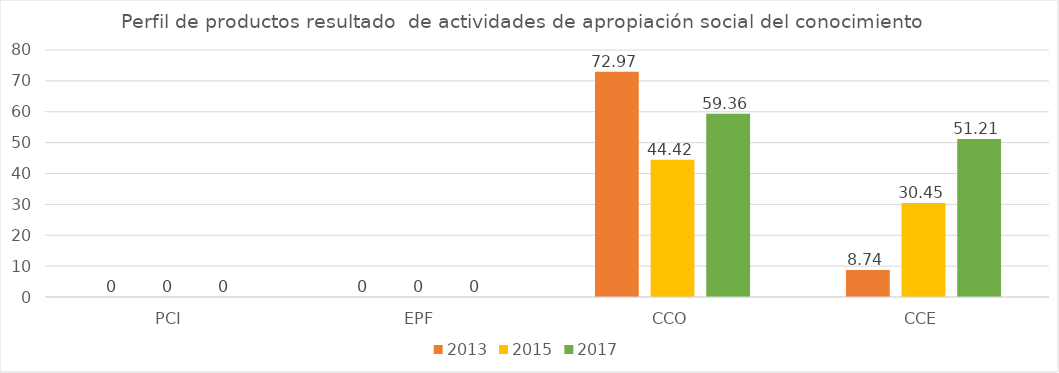
| Category | 2013 | 2015 | 2017 |
|---|---|---|---|
| PCI | 0 | 0 | 0 |
| EPF | 0 | 0 | 0 |
| CCO | 72.97 | 44.42 | 59.36 |
| CCE | 8.74 | 30.45 | 51.21 |